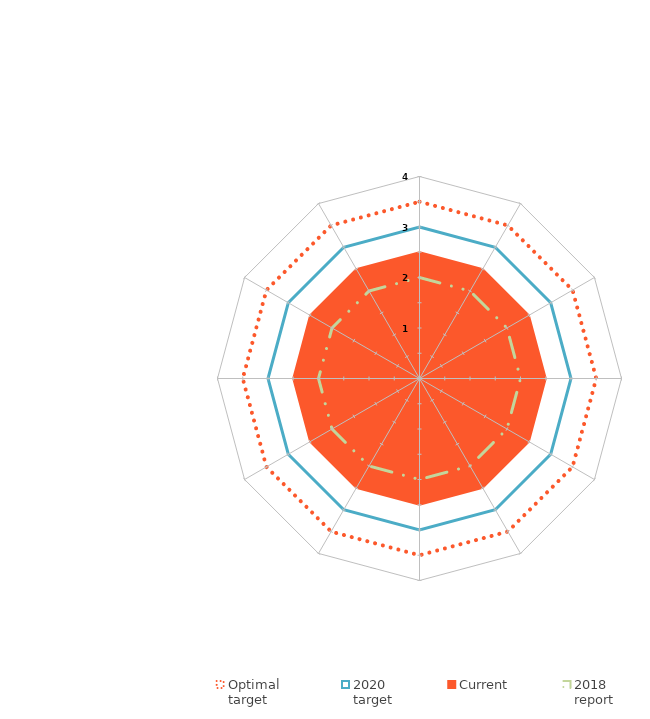
| Category | Optimal
target | 2020
target | Current | 2018
report |
|---|---|---|---|---|
| Monitoring & assurance | 3.5 | 3 | 2.5 | 2 |
| Culture & behaviours | 3.5 | 3 | 2.5 | 2 |
| Education & communications | 3.5 | 3 | 2.5 | 2 |
| Strategy & planning | 3.5 | 3 | 2.5 | 2 |
| Policies, processes, & procedures | 3.5 | 3 | 2.5 | 2 |
| Risk management | 3.5 | 3 | 2.5 | 2 |
| Incident management | 3.5 | 3 | 2.5 | 2 |
| Personnel security | 3.5 | 3 | 2.5 | 2 |
| Information security | 3.5 | 3 | 2.5 | 2 |
| Physical security | 3.5 | 3 | 2.5 | 2 |
| Executive commitment & oversight | 3.5 | 3 | 2.5 | 2 |
| Management structure, roles, & responsibilities | 3.5 | 3 | 2.5 | 2 |